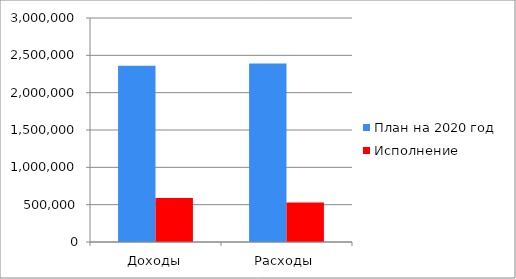
| Category | План на 2020 год | Исполнение |
|---|---|---|
| Доходы | 2361395 | 590479 |
| Расходы | 2392156 | 528592 |